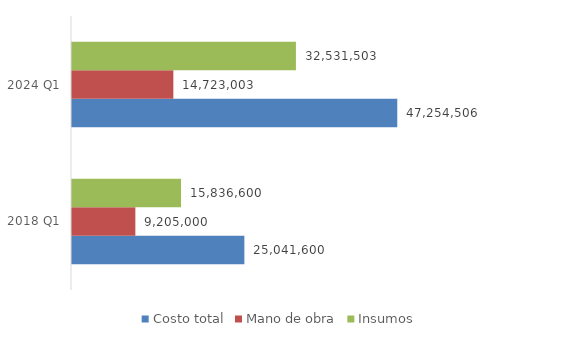
| Category | Costo total | Mano de obra | Insumos |
|---|---|---|---|
| 2018 Q1 | 25041600 | 9205000 | 15836600 |
| 2024 Q1 | 47254506.436 | 14723003 | 32531503.436 |